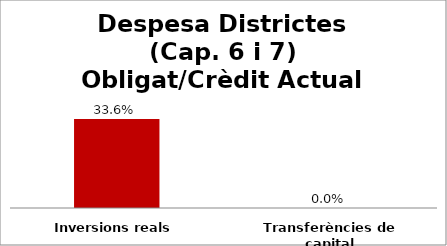
| Category | Series 0 |
|---|---|
| Inversions reals | 0.336 |
| Transferències de capital | 0 |